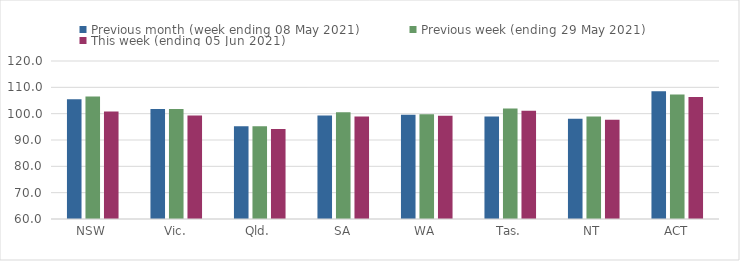
| Category | Previous month (week ending 08 May 2021) | Previous week (ending 29 May 2021) | This week (ending 05 Jun 2021) |
|---|---|---|---|
| NSW | 105.46 | 106.49 | 100.81 |
| Vic. | 101.79 | 101.76 | 99.33 |
| Qld. | 95.26 | 95.25 | 94.19 |
| SA | 99.29 | 100.55 | 98.92 |
| WA | 99.6 | 99.74 | 99.17 |
| Tas. | 98.95 | 101.97 | 101.1 |
| NT | 98.08 | 98.92 | 97.68 |
| ACT | 108.48 | 107.27 | 106.33 |